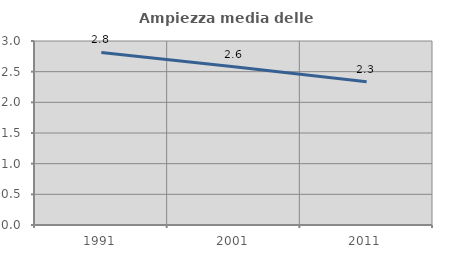
| Category | Ampiezza media delle famiglie |
|---|---|
| 1991.0 | 2.814 |
| 2001.0 | 2.581 |
| 2011.0 | 2.335 |